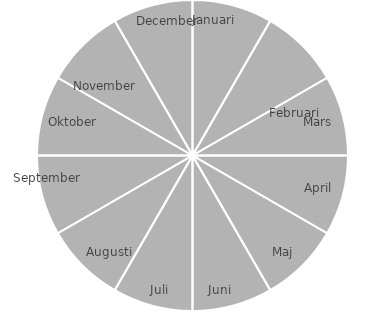
| Category | Series 0 |
|---|---|
| Januari | 1 |
| Februari


 | 1 |
| Mars | 1 |
| April | 1 |
| Maj | 1 |
| Juni | 1 |
| Juli | 1 |
| Augusti | 1 |
| September | 1 |
| Oktober | 1 |
| November | 1 |
| December | 1 |